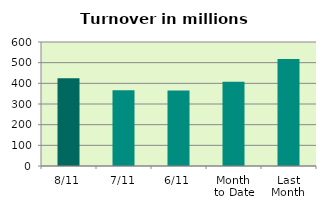
| Category | Series 0 |
|---|---|
| 8/11 | 424.029 |
| 7/11 | 365.989 |
| 6/11 | 365.818 |
| Month 
to Date | 408.049 |
| Last
Month | 517.71 |